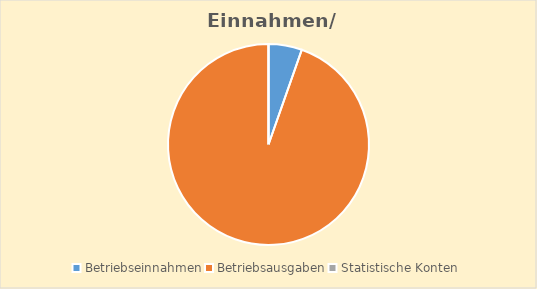
| Category | Series 0 |
|---|---|
| Betriebseinnahmen | 200 |
| Betriebsausgaben | 3517.17 |
| Statistische Konten | 0 |